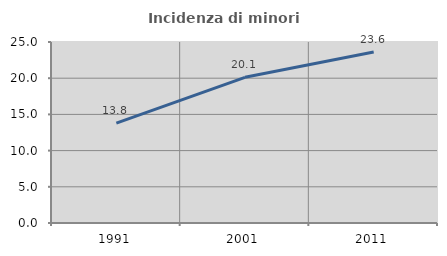
| Category | Incidenza di minori stranieri |
|---|---|
| 1991.0 | 13.793 |
| 2001.0 | 20.126 |
| 2011.0 | 23.626 |